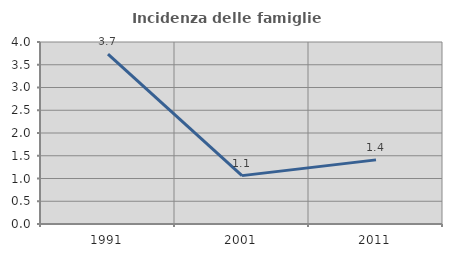
| Category | Incidenza delle famiglie numerose |
|---|---|
| 1991.0 | 3.733 |
| 2001.0 | 1.063 |
| 2011.0 | 1.409 |